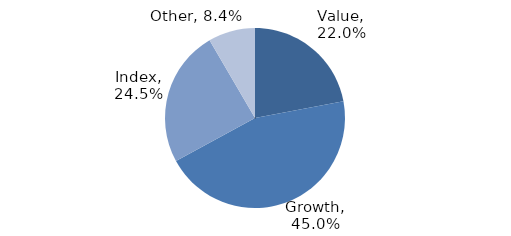
| Category | Investment Style |
|---|---|
| Value | 0.22 |
| Growth | 0.45 |
| Index | 0.245 |
| Other | 0.084 |